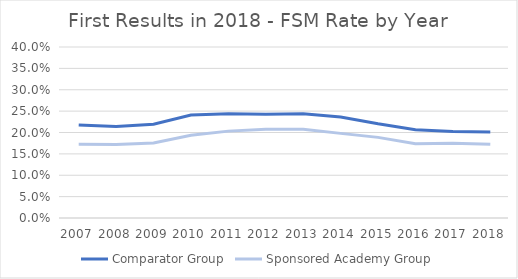
| Category | Comparator Group | Sponsored Academy Group |
|---|---|---|
| 2007.0 | 0.218 | 0.173 |
| 2008.0 | 0.214 | 0.172 |
| 2009.0 | 0.219 | 0.175 |
| 2010.0 | 0.241 | 0.193 |
| 2011.0 | 0.244 | 0.203 |
| 2012.0 | 0.243 | 0.207 |
| 2013.0 | 0.244 | 0.207 |
| 2014.0 | 0.236 | 0.198 |
| 2015.0 | 0.22 | 0.189 |
| 2016.0 | 0.207 | 0.174 |
| 2017.0 | 0.202 | 0.175 |
| 2018.0 | 0.201 | 0.172 |